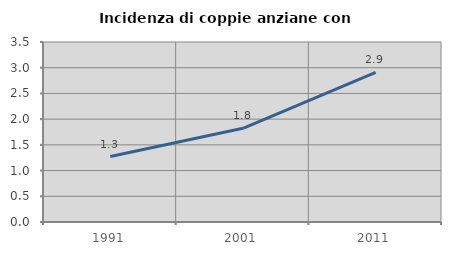
| Category | Incidenza di coppie anziane con figli |
|---|---|
| 1991.0 | 1.273 |
| 2001.0 | 1.821 |
| 2011.0 | 2.908 |